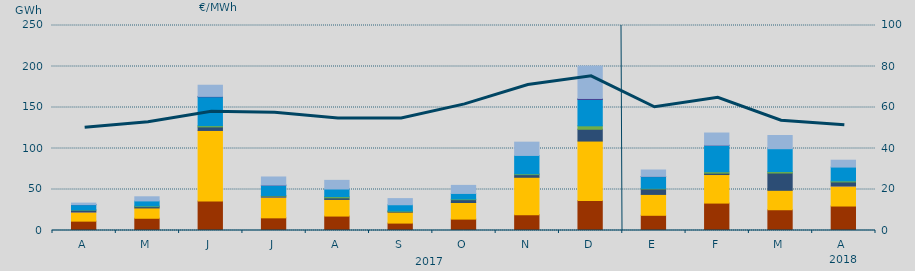
| Category | Carbón | Ciclo Combinado | Cogeneración | Consumo Bombeo | Eólica | Hidráulica | Nuclear | Turbinación bombeo |
|---|---|---|---|---|---|---|---|---|
| A | 11417.3 | 11177.4 | 1 | 2298.7 | 146.3 | 6448.1 | 105 | 1824.9 |
| M | 14921.9 | 12578.5 | 0 | 1623.5 | 791 | 6148.7 | 0 | 5041.6 |
| J | 35897.1 | 86103.9 | 16 | 4321.9 | 1499 | 35181.7 | 537 | 13587.3 |
| J | 15424.3 | 25298.7 | 6 | 1196.5 | 694.8 | 12560.8 | 231 | 9853.3 |
| A | 17604.1 | 20278.5 | 0 | 1953.7 | 1479 | 9282.6 | 0 | 10537.6 |
| S | 9030.9 | 13355.9 | 0 | 972.7 | 456.9 | 7586.6 | 0 | 7497.3 |
| O | 13899.2 | 20227.3 | 0 | 3473.9 | 731.2 | 6859.3 | 0 | 9809.3 |
| N | 19298.3 | 45604 | 0 | 3226 | 983.4 | 22432 | 0 | 16186.5 |
| D | 36464.5 | 72616.8 | 0 | 14393.3 | 4195.1 | 32118.7 | 1236 | 39485.4 |
| E | 18538.8 | 25466.6 | 0 | 6696 | 686 | 14339.3 | 277 | 7767.7 |
| F | 33434.8 | 34817.7 | 0 | 1704 | 1654.6 | 32219.8 | 258 | 14790.9 |
| M | 25308.3 | 23702.3 | 0 | 21100.1 | 1712.3 | 27908.3 | 0 | 16090.2 |
| A | 29845.7 | 24356.1 | 74 | 4947.9 | 1233.1 | 16888.6 | 0 | 8367.7 |